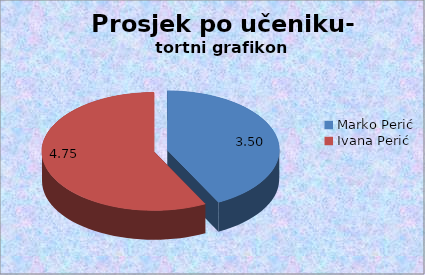
| Category | Series 0 |
|---|---|
| Marko Perić | 3.5 |
| Ivana Perić | 4.75 |